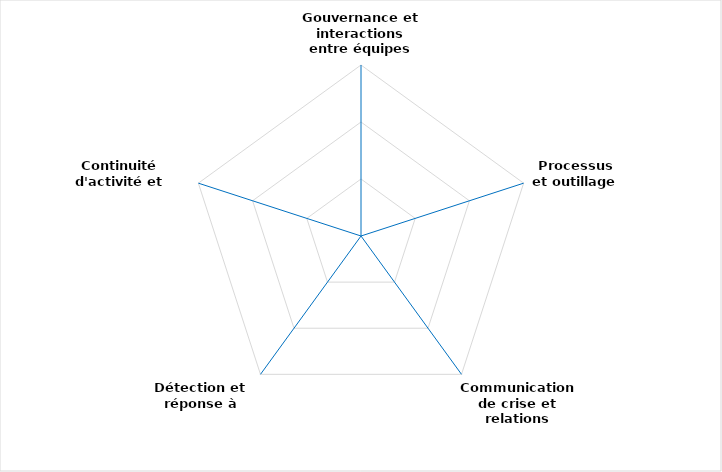
| Category | Series 1 | Series 0 |
|---|---|---|
| Gouvernance et interactions entre équipes mobilisées | 0 | 0 |
| Processus et outillage | 0 | 0 |
| Communication de crise et relations externes | 0 | 0 |
| Détection et réponse à incidents | 0 | 0 |
| Continuité d'activité et reconstruction | 0 | 0 |